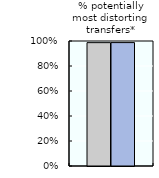
| Category | 2000-02 | 2016-18 |
|---|---|---|
| % potentially most distorting transfers* | 0.987 | 0.987 |